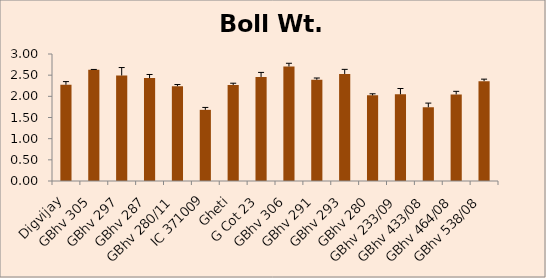
| Category | Boll Wt. (g) |
|---|---|
| Digvijay | 2.274 |
| GBhv 305 | 2.626 |
| GBhv 297 | 2.492 |
| GBhv 287 | 2.431 |
| GBhv 280/11 | 2.24 |
| IC 371009 | 1.68 |
| Gheti | 2.268 |
| G Cot 23 | 2.458 |
| GBhv 306 | 2.706 |
| GBhv 291 | 2.391 |
| GBhv 293 | 2.528 |
| GBhv 280 | 2.023 |
| GBhv 233/09 | 2.047 |
| GBhv 433/08 | 1.742 |
| GBhv 464/08 | 2.046 |
| GBhv 538/08 | 2.358 |